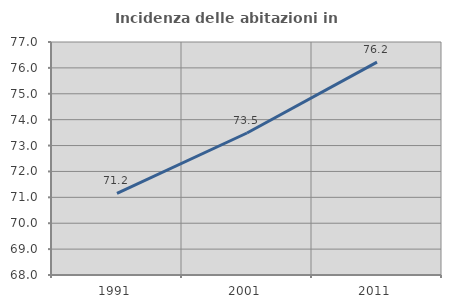
| Category | Incidenza delle abitazioni in proprietà  |
|---|---|
| 1991.0 | 71.153 |
| 2001.0 | 73.485 |
| 2011.0 | 76.225 |